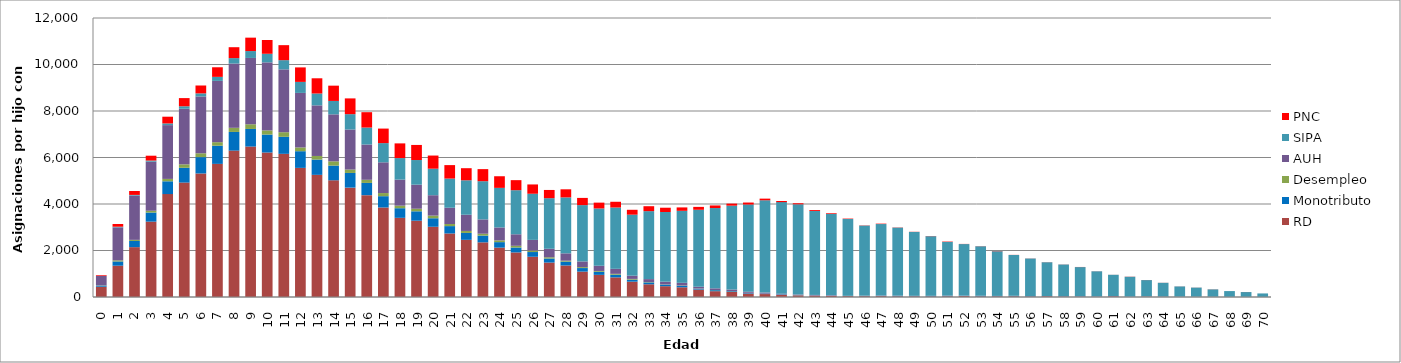
| Category | RD | Monotributo | Desempleo | AUH | SIPA | PNC |
|---|---|---|---|---|---|---|
| 0.0 | 442 | 51 | 9 | 405 | 2 | 29 |
| 1.0 | 1346 | 183 | 48 | 1418 | 28 | 116 |
| 2.0 | 2144 | 266 | 48 | 1905 | 28 | 169 |
| 3.0 | 3241 | 392 | 77 | 2109 | 50 | 208 |
| 4.0 | 4427 | 550 | 102 | 2314 | 72 | 290 |
| 5.0 | 4922 | 635 | 149 | 2392 | 105 | 352 |
| 6.0 | 5313 | 703 | 166 | 2444 | 132 | 339 |
| 7.0 | 5726 | 781 | 152 | 2636 | 173 | 413 |
| 8.0 | 6296 | 803 | 178 | 2764 | 234 | 469 |
| 9.0 | 6471 | 756 | 202 | 2853 | 296 | 577 |
| 10.0 | 6214 | 773 | 178 | 2927 | 369 | 592 |
| 11.0 | 6158 | 731 | 199 | 2702 | 397 | 645 |
| 12.0 | 5553 | 718 | 161 | 2346 | 474 | 623 |
| 13.0 | 5254 | 657 | 155 | 2176 | 510 | 655 |
| 14.0 | 5019 | 633 | 183 | 2021 | 577 | 657 |
| 15.0 | 4704 | 631 | 147 | 1722 | 660 | 678 |
| 16.0 | 4380 | 526 | 136 | 1516 | 730 | 661 |
| 17.0 | 3850 | 486 | 135 | 1322 | 826 | 625 |
| 18.0 | 3405 | 414 | 110 | 1120 | 926 | 632 |
| 19.0 | 3281 | 405 | 111 | 1034 | 1060 | 649 |
| 20.0 | 3021 | 366 | 114 | 877 | 1141 | 565 |
| 21.0 | 2732 | 317 | 90 | 700 | 1255 | 579 |
| 22.0 | 2459 | 296 | 86 | 697 | 1482 | 520 |
| 23.0 | 2351 | 290 | 80 | 616 | 1644 | 519 |
| 24.0 | 2124 | 236 | 75 | 556 | 1703 | 500 |
| 25.0 | 1917 | 211 | 74 | 496 | 1896 | 432 |
| 26.0 | 1731 | 203 | 65 | 458 | 1984 | 400 |
| 27.0 | 1481 | 174 | 54 | 366 | 2175 | 354 |
| 28.0 | 1356 | 165 | 41 | 316 | 2406 | 348 |
| 29.0 | 1092 | 153 | 40 | 245 | 2422 | 310 |
| 30.0 | 952 | 134 | 34 | 224 | 2464 | 251 |
| 31.0 | 844 | 115 | 37 | 216 | 2637 | 247 |
| 32.0 | 660 | 85 | 33 | 139 | 2624 | 210 |
| 33.0 | 547 | 81 | 15 | 127 | 2923 | 212 |
| 34.0 | 465 | 66 | 10 | 118 | 2998 | 183 |
| 35.0 | 418 | 64 | 14 | 114 | 3097 | 146 |
| 36.0 | 319 | 41 | 8 | 73 | 3311 | 124 |
| 37.0 | 250 | 44 | 7 | 72 | 3453 | 112 |
| 38.0 | 220 | 30 | 6 | 65 | 3608 | 87 |
| 39.0 | 150 | 28 | 3 | 49 | 3747 | 86 |
| 40.0 | 126 | 18 | 2 | 46 | 3968 | 71 |
| 41.0 | 91 | 23 | 3 | 26 | 3938 | 49 |
| 42.0 | 69 | 7 | 3 | 27 | 3881 | 45 |
| 43.0 | 57 | 10 | 2 | 20 | 3611 | 38 |
| 44.0 | 49 | 12 | 0 | 17 | 3498 | 29 |
| 45.0 | 37 | 7 | 0 | 6 | 3304 | 18 |
| 46.0 | 34 | 15 | 2 | 7 | 3014 | 10 |
| 47.0 | 37 | 14 | 0 | 13 | 3074 | 17 |
| 48.0 | 30 | 16 | 1 | 9 | 2929 | 9 |
| 49.0 | 27 | 11 | 1 | 11 | 2748 | 7 |
| 50.0 | 25 | 16 | 0 | 9 | 2566 | 9 |
| 51.0 | 30 | 12 | 2 | 13 | 2312 | 16 |
| 52.0 | 39 | 16 | 0 | 6 | 2216 | 6 |
| 53.0 | 27 | 18 | 0 | 8 | 2129 | 6 |
| 54.0 | 27 | 12 | 1 | 6 | 1923 | 10 |
| 55.0 | 31 | 15 | 0 | 6 | 1756 | 4 |
| 56.0 | 21 | 14 | 0 | 3 | 1618 | 4 |
| 57.0 | 31 | 7 | 1 | 4 | 1452 | 4 |
| 58.0 | 20 | 12 | 0 | 3 | 1363 | 4 |
| 59.0 | 17 | 11 | 1 | 6 | 1252 | 5 |
| 60.0 | 13 | 11 | 0 | 4 | 1078 | 3 |
| 61.0 | 28 | 8 | 0 | 6 | 914 | 2 |
| 62.0 | 6 | 11 | 0 | 3 | 851 | 6 |
| 63.0 | 19 | 5 | 1 | 3 | 700 | 4 |
| 64.0 | 14 | 6 | 0 | 1 | 590 | 3 |
| 65.0 | 9 | 3 | 0 | 3 | 440 | 3 |
| 66.0 | 10 | 0 | 0 | 0 | 395 | 3 |
| 67.0 | 9 | 2 | 0 | 0 | 318 | 4 |
| 68.0 | 4 | 2 | 0 | 0 | 249 | 1 |
| 69.0 | 3 | 1 | 0 | 1 | 208 | 3 |
| 70.0 | 3 | 0 | 0 | 0 | 150 | 1 |